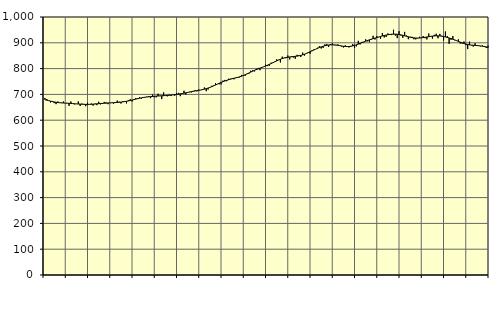
| Category | Piggar | Series 1 |
|---|---|---|
| nan | 686.3 | 679.4 |
| 1.0 | 682.1 | 677.59 |
| 1.0 | 677 | 675.92 |
| 1.0 | 668.8 | 673.94 |
| 1.0 | 674.1 | 672.25 |
| 1.0 | 666.3 | 670.73 |
| 1.0 | 662.2 | 669.46 |
| 1.0 | 672.5 | 668.46 |
| 1.0 | 667.3 | 667.6 |
| 1.0 | 668.4 | 667.02 |
| 1.0 | 672.4 | 666.6 |
| 1.0 | 666.6 | 666.3 |
| nan | 665.2 | 665.97 |
| 2.0 | 655.7 | 665.51 |
| 2.0 | 672.4 | 664.94 |
| 2.0 | 663.4 | 664.33 |
| 2.0 | 661.2 | 663.74 |
| 2.0 | 663.1 | 663.21 |
| 2.0 | 672.8 | 662.74 |
| 2.0 | 655 | 662.33 |
| 2.0 | 664.3 | 661.95 |
| 2.0 | 660.6 | 661.62 |
| 2.0 | 654.2 | 661.35 |
| 2.0 | 667.4 | 661.2 |
| nan | 661.2 | 661.27 |
| 3.0 | 664.9 | 661.57 |
| 3.0 | 656.5 | 662.08 |
| 3.0 | 664.1 | 662.73 |
| 3.0 | 658.4 | 663.42 |
| 3.0 | 671.6 | 664.08 |
| 3.0 | 661.2 | 664.67 |
| 3.0 | 663.5 | 665.19 |
| 3.0 | 670.8 | 665.68 |
| 3.0 | 669.2 | 666.16 |
| 3.0 | 662.1 | 666.63 |
| 3.0 | 667.6 | 667.06 |
| nan | 666.7 | 667.44 |
| 4.0 | 664.2 | 667.84 |
| 4.0 | 667.2 | 668.28 |
| 4.0 | 675.9 | 668.81 |
| 4.0 | 671.7 | 669.41 |
| 4.0 | 664.7 | 670.14 |
| 4.0 | 673.1 | 671.01 |
| 4.0 | 674.2 | 672.08 |
| 4.0 | 665 | 673.32 |
| 4.0 | 676.7 | 674.71 |
| 4.0 | 681.2 | 676.28 |
| 4.0 | 672.8 | 678.01 |
| nan | 678.9 | 679.83 |
| 5.0 | 686 | 681.7 |
| 5.0 | 682 | 683.49 |
| 5.0 | 689.3 | 685.11 |
| 5.0 | 683.6 | 686.59 |
| 5.0 | 686.8 | 687.87 |
| 5.0 | 689.2 | 688.97 |
| 5.0 | 691 | 689.9 |
| 5.0 | 693 | 690.71 |
| 5.0 | 685.4 | 691.46 |
| 5.0 | 699.8 | 692.13 |
| 5.0 | 688.7 | 692.76 |
| nan | 688.7 | 693.35 |
| 6.0 | 702.6 | 693.85 |
| 6.0 | 693.5 | 694.29 |
| 6.0 | 681.7 | 694.72 |
| 6.0 | 707.8 | 695.11 |
| 6.0 | 696.2 | 695.54 |
| 6.0 | 692.4 | 696.03 |
| 6.0 | 698.9 | 696.6 |
| 6.0 | 693.6 | 697.27 |
| 6.0 | 698.5 | 698.05 |
| 6.0 | 694.9 | 698.93 |
| 6.0 | 704.8 | 699.9 |
| nan | 705.9 | 701 |
| 7.0 | 693.1 | 702.18 |
| 7.0 | 704 | 703.43 |
| 7.0 | 714.2 | 704.75 |
| 7.0 | 699.3 | 706.15 |
| 7.0 | 707.1 | 707.59 |
| 7.0 | 710.3 | 709.09 |
| 7.0 | 707.8 | 710.58 |
| 7.0 | 713.6 | 712.01 |
| 7.0 | 716.3 | 713.33 |
| 7.0 | 711.9 | 714.56 |
| 7.0 | 718.8 | 715.77 |
| nan | 716.5 | 717.09 |
| 8.0 | 719.9 | 718.59 |
| 8.0 | 726.9 | 720.33 |
| 8.0 | 712.3 | 722.32 |
| 8.0 | 718.8 | 724.58 |
| 8.0 | 726.5 | 727.18 |
| 8.0 | 733.4 | 730.04 |
| 8.0 | 734.6 | 733.16 |
| 8.0 | 743.5 | 736.45 |
| 8.0 | 739.4 | 739.8 |
| 8.0 | 739.3 | 743.14 |
| 8.0 | 738.8 | 746.33 |
| nan | 753.3 | 749.29 |
| 9.0 | 756 | 752 |
| 9.0 | 751 | 754.47 |
| 9.0 | 760.6 | 756.74 |
| 9.0 | 760.7 | 758.87 |
| 9.0 | 762.7 | 760.8 |
| 9.0 | 758.6 | 762.6 |
| 9.0 | 765.5 | 764.35 |
| 9.0 | 764 | 766.14 |
| 9.0 | 765.9 | 768.15 |
| 9.0 | 775.5 | 770.52 |
| 9.0 | 771.8 | 773.27 |
| nan | 772 | 776.31 |
| 10.0 | 778.9 | 779.55 |
| 10.0 | 780.4 | 782.94 |
| 10.0 | 791.7 | 786.38 |
| 10.0 | 793 | 789.73 |
| 10.0 | 788.9 | 792.94 |
| 10.0 | 799.2 | 795.97 |
| 10.0 | 802.7 | 798.84 |
| 10.0 | 793.9 | 801.63 |
| 10.0 | 805.9 | 804.41 |
| 10.0 | 807.1 | 807.2 |
| 10.0 | 815.3 | 810.08 |
| nan | 809.6 | 813.1 |
| 11.0 | 810.3 | 816.28 |
| 11.0 | 822.8 | 819.58 |
| 11.0 | 822.4 | 822.98 |
| 11.0 | 825.6 | 826.46 |
| 11.0 | 836 | 829.92 |
| 11.0 | 834 | 833.21 |
| 11.0 | 823.9 | 836.23 |
| 11.0 | 846.3 | 838.86 |
| 11.0 | 841.9 | 841.08 |
| 11.0 | 840.4 | 842.84 |
| 11.0 | 850.7 | 844.17 |
| nan | 835.5 | 845.2 |
| 12.0 | 847.9 | 846.05 |
| 12.0 | 842.7 | 846.81 |
| 12.0 | 838 | 847.57 |
| 12.0 | 853.3 | 848.48 |
| 12.0 | 852.1 | 849.63 |
| 12.0 | 845.2 | 851.17 |
| 12.0 | 862 | 853.23 |
| 12.0 | 850.4 | 855.78 |
| 12.0 | 857.6 | 858.65 |
| 12.0 | 864.5 | 861.81 |
| 12.0 | 857.8 | 865.14 |
| nan | 870.8 | 868.5 |
| 13.0 | 874.2 | 871.85 |
| 13.0 | 874.7 | 875.18 |
| 13.0 | 880.7 | 878.41 |
| 13.0 | 886.9 | 881.45 |
| 13.0 | 878 | 884.19 |
| 13.0 | 880.4 | 886.62 |
| 13.0 | 893.9 | 888.67 |
| 13.0 | 895.5 | 890.25 |
| 13.0 | 883.9 | 891.4 |
| 13.0 | 894.8 | 892.07 |
| 13.0 | 897.3 | 892.23 |
| nan | 890.7 | 891.96 |
| 14.0 | 889.9 | 891.3 |
| 14.0 | 893.6 | 890.27 |
| 14.0 | 889.5 | 889.03 |
| 14.0 | 885.4 | 887.72 |
| 14.0 | 882 | 886.56 |
| 14.0 | 890.1 | 885.74 |
| 14.0 | 885.8 | 885.39 |
| 14.0 | 882.2 | 885.63 |
| 14.0 | 884.9 | 886.54 |
| 14.0 | 895 | 888.04 |
| 14.0 | 879.6 | 890.01 |
| nan | 886.3 | 892.34 |
| 15.0 | 907.6 | 894.93 |
| 15.0 | 893.7 | 897.73 |
| 15.0 | 903.7 | 900.57 |
| 15.0 | 902.2 | 903.41 |
| 15.0 | 913.5 | 906.23 |
| 15.0 | 905.8 | 908.95 |
| 15.0 | 902.5 | 911.48 |
| 15.0 | 912 | 913.87 |
| 15.0 | 927 | 916.07 |
| 15.0 | 912.9 | 918.15 |
| 15.0 | 926.2 | 920.26 |
| nan | 921.8 | 922.4 |
| 16.0 | 915.6 | 924.48 |
| 16.0 | 938.1 | 926.49 |
| 16.0 | 920.8 | 928.34 |
| 16.0 | 922.8 | 929.93 |
| 16.0 | 936.3 | 931.29 |
| 16.0 | 934.1 | 932.37 |
| 16.0 | 929.9 | 933.15 |
| 16.0 | 950.6 | 933.59 |
| 16.0 | 927.9 | 933.59 |
| 16.0 | 918.1 | 933.12 |
| 16.0 | 945.1 | 932.17 |
| nan | 927.9 | 930.78 |
| 17.0 | 918.8 | 929.04 |
| 17.0 | 942.3 | 927.09 |
| 17.0 | 928.4 | 925.1 |
| 17.0 | 913.9 | 923.23 |
| 17.0 | 923.6 | 921.55 |
| 17.0 | 923.2 | 920.17 |
| 17.0 | 913.8 | 919.16 |
| 17.0 | 913.3 | 918.5 |
| 17.0 | 917.3 | 918.28 |
| 17.0 | 923.3 | 918.56 |
| 17.0 | 918.3 | 919.22 |
| nan | 926.3 | 920.21 |
| 18.0 | 918 | 921.37 |
| 18.0 | 913.2 | 922.53 |
| 18.0 | 936 | 923.66 |
| 18.0 | 922.9 | 924.82 |
| 18.0 | 916 | 925.85 |
| 18.0 | 930.9 | 926.59 |
| 18.0 | 935.1 | 926.97 |
| 18.0 | 917.5 | 926.95 |
| 18.0 | 934.6 | 926.5 |
| 18.0 | 927.2 | 925.61 |
| 18.0 | 909.1 | 924.29 |
| nan | 943.8 | 922.61 |
| 19.0 | 926 | 920.74 |
| 19.0 | 896.1 | 918.67 |
| 19.0 | 911.8 | 916.38 |
| 19.0 | 926 | 913.87 |
| 19.0 | 909.9 | 911.2 |
| 19.0 | 909.4 | 908.38 |
| 19.0 | 913.5 | 905.46 |
| 19.0 | 897 | 902.56 |
| 19.0 | 897.3 | 899.83 |
| 19.0 | 905.1 | 897.32 |
| 19.0 | 891 | 895.18 |
| nan | 875.7 | 893.43 |
| 20.0 | 904.3 | 892.01 |
| 20.0 | 890 | 891.05 |
| 20.0 | 885.3 | 890.45 |
| 20.0 | 898.2 | 889.95 |
| 20.0 | 891 | 889.39 |
| 20.0 | 887.4 | 888.73 |
| 20.0 | 886.2 | 887.86 |
| 20.0 | 889.6 | 886.78 |
| 20.0 | 883.6 | 885.5 |
| 20.0 | 880 | 884.03 |
| 20.0 | 888.5 | 882.42 |